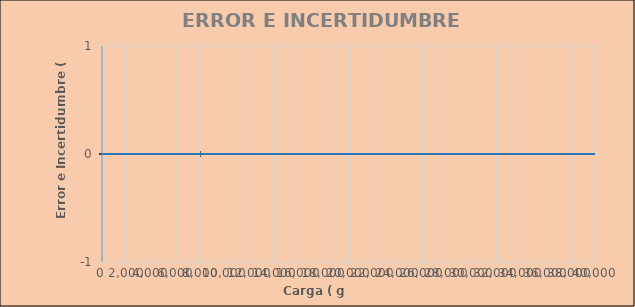
| Category | ERROR (g) |
|---|---|
| #N/A | 0 |
| #N/A | 0 |
| #N/A | 0 |
| #N/A | 0 |
| 0.0 | 0 |